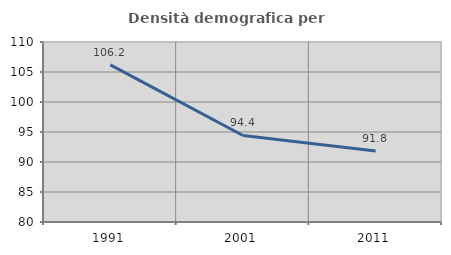
| Category | Densità demografica |
|---|---|
| 1991.0 | 106.191 |
| 2001.0 | 94.42 |
| 2011.0 | 91.822 |